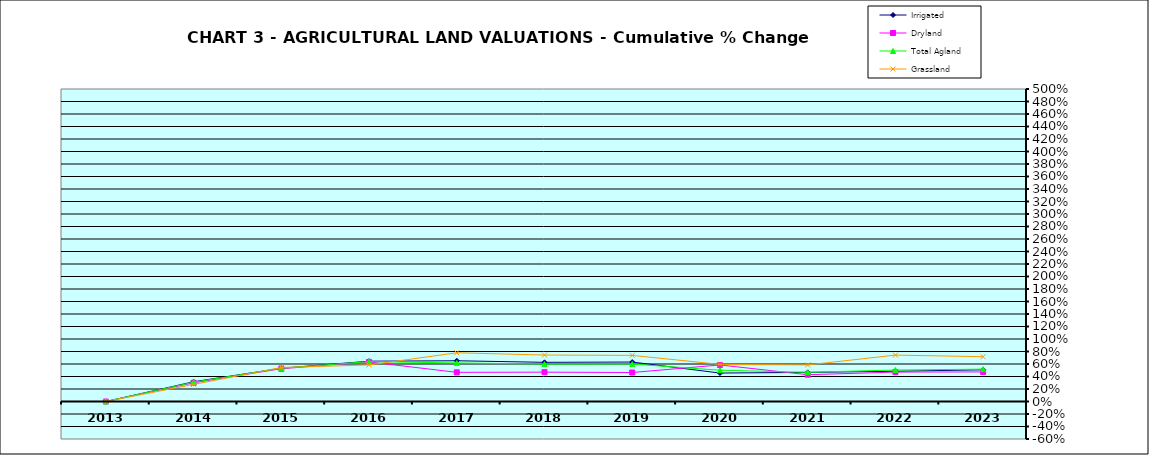
| Category | Irrigated | Dryland | Total Agland | Grassland |
|---|---|---|---|---|
| 2013.0 | 0 | 0 | 0 | 0 |
| 2014.0 | 0.316 | 0.299 | 0.309 | 0.274 |
| 2015.0 | 0.532 | 0.525 | 0.532 | 0.544 |
| 2016.0 | 0.645 | 0.633 | 0.638 | 0.585 |
| 2017.0 | 0.652 | 0.467 | 0.617 | 0.78 |
| 2018.0 | 0.627 | 0.469 | 0.598 | 0.743 |
| 2019.0 | 0.631 | 0.464 | 0.599 | 0.738 |
| 2020.0 | 0.455 | 0.585 | 0.5 | 0.594 |
| 2021.0 | 0.466 | 0.428 | 0.468 | 0.585 |
| 2022.0 | 0.484 | 0.471 | 0.503 | 0.742 |
| 2023.0 | 0.507 | 0.473 | 0.518 | 0.717 |